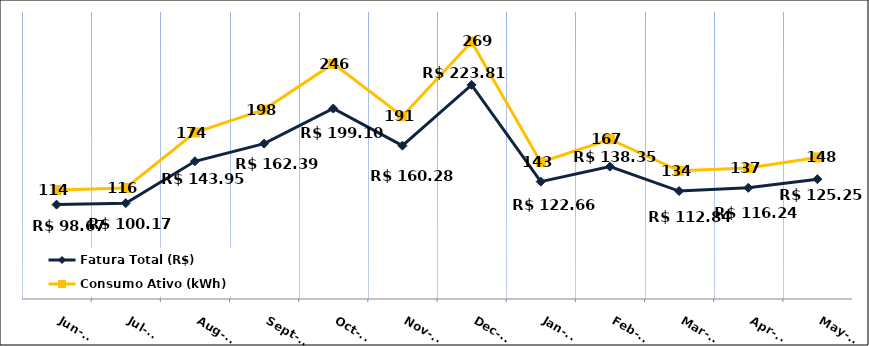
| Category | Fatura Total (R$) |
|---|---|
| 2023-06-01 | 98.67 |
| 2023-07-01 | 100.17 |
| 2023-08-01 | 143.95 |
| 2023-09-01 | 162.39 |
| 2023-10-01 | 199.1 |
| 2023-11-01 | 160.28 |
| 2023-12-01 | 223.81 |
| 2024-01-01 | 122.66 |
| 2024-02-01 | 138.35 |
| 2024-03-01 | 112.84 |
| 2024-04-01 | 116.24 |
| 2024-05-01 | 125.25 |